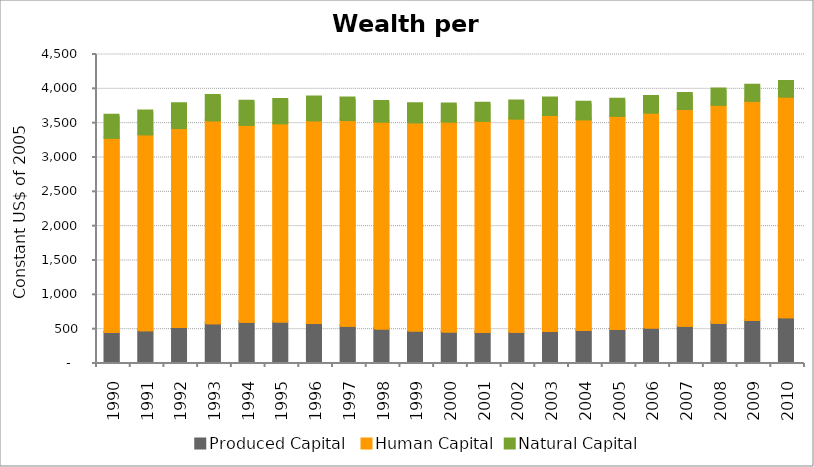
| Category | Produced Capital  | Human Capital | Natural Capital |
|---|---|---|---|
| 1990.0 | 438.135 | 2828.343 | 328.11 |
| 1991.0 | 462.574 | 2853.41 | 338.122 |
| 1992.0 | 509.686 | 2896.539 | 353.129 |
| 1993.0 | 565.086 | 2954.609 | 362.903 |
| 1994.0 | 584.462 | 2869.69 | 342.909 |
| 1995.0 | 588.924 | 2889.289 | 346.361 |
| 1996.0 | 567.455 | 2952.696 | 340.712 |
| 1997.0 | 528.956 | 2993.782 | 320.161 |
| 1998.0 | 488.015 | 3013.641 | 291.945 |
| 1999.0 | 458.946 | 3031.093 | 271.987 |
| 2000.0 | 442.599 | 3060.156 | 254.774 |
| 2001.0 | 437.782 | 3076.3 | 253.021 |
| 2002.0 | 440.953 | 3106.251 | 255.178 |
| 2003.0 | 450.504 | 3147.04 | 248.062 |
| 2004.0 | 464.424 | 3070.761 | 246.302 |
| 2005.0 | 480.85 | 3103.83 | 241.209 |
| 2006.0 | 500.664 | 3131.795 | 235.818 |
| 2007.0 | 529.219 | 3154.691 | 226.65 |
| 2008.0 | 572.543 | 3173.968 | 229.411 |
| 2009.0 | 612.314 | 3193.342 | 223.427 |
| 2010.0 | 652.848 | 3214.21 | 217.764 |